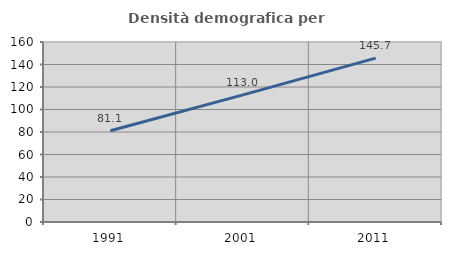
| Category | Densità demografica |
|---|---|
| 1991.0 | 81.149 |
| 2001.0 | 112.964 |
| 2011.0 | 145.692 |